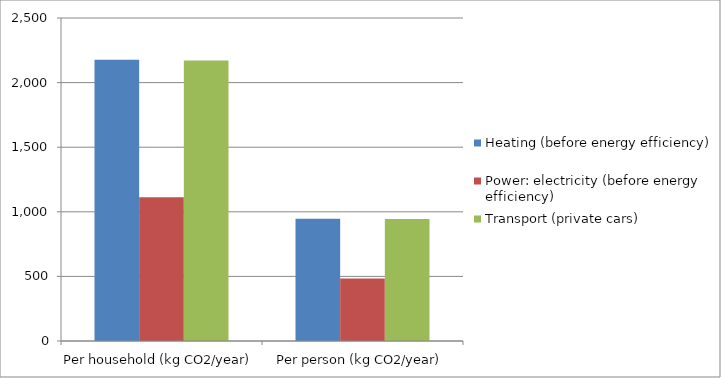
| Category | Heating (before energy efficiency) | Power: electricity (before energy efficiency) | Transport (private cars) |
|---|---|---|---|
| Per household (kg CO2/year) | 2176.743 | 1113.043 | 2170.607 |
| Per person (kg CO2/year) | 946.41 | 483.932 | 943.742 |